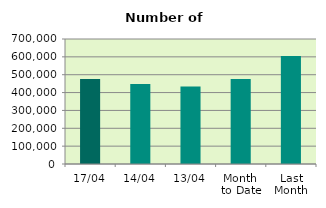
| Category | Series 0 |
|---|---|
| 17/04 | 475658 |
| 14/04 | 447884 |
| 13/04 | 434568 |
| Month 
to Date | 475601.556 |
| Last
Month | 605064 |